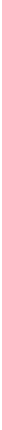
| Category | % |
|---|---|
| شركة تأمين الائتمان اللبنانية | 0.281 |
| بنك التصدير والاستيراد التركي | 0.216 |
| الشركة الجزائرية لتأمين وضمان الصادرات | 0.187 |
| المؤسسة الاسلامية لتأمين الاستثمار وائتمان الصادرات | 0.106 |
| باقي الأعضاء | 0.209 |